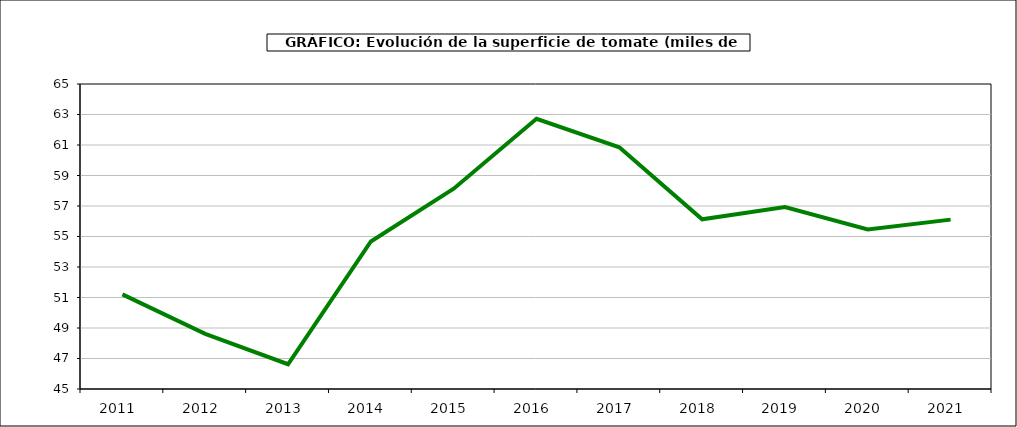
| Category | superficie |
|---|---|
| 2011.0 | 51.204 |
| 2012.0 | 48.617 |
| 2013.0 | 46.623 |
| 2014.0 | 54.675 |
| 2015.0 | 58.134 |
| 2016.0 | 62.715 |
| 2017.0 | 60.852 |
| 2018.0 | 56.128 |
| 2019.0 | 56.937 |
| 2020.0 | 55.468 |
| 2021.0 | 56.106 |